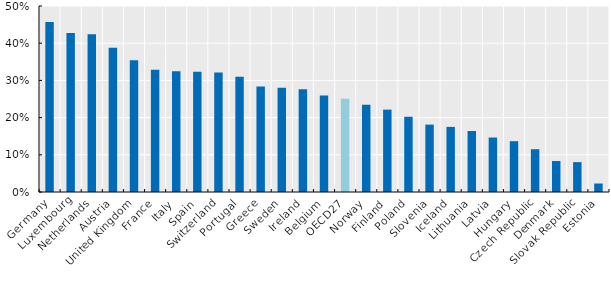
| Category | 2015 or latest |
|---|---|
| Germany | 0.457 |
| Luxembourg | 0.428 |
| Netherlands | 0.424 |
| Austria | 0.388 |
| United Kingdom | 0.354 |
| France | 0.329 |
| Italy | 0.325 |
| Spain | 0.323 |
| Switzerland | 0.321 |
| Portugal | 0.31 |
| Greece | 0.284 |
| Sweden | 0.281 |
| Ireland | 0.276 |
| Belgium | 0.259 |
| OECD27 | 0.251 |
| Norway | 0.235 |
| Finland | 0.221 |
| Poland | 0.202 |
| Slovenia | 0.181 |
| Iceland | 0.175 |
| Lithuania | 0.164 |
| Latvia | 0.146 |
| Hungary | 0.137 |
| Czech Republic | 0.115 |
| Denmark | 0.083 |
| Slovak Republic | 0.08 |
| Estonia | 0.023 |